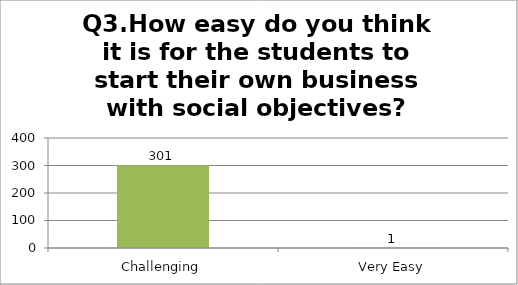
| Category | Q3.How easy do you think it is for the students to start their own business with social objectives? |
|---|---|
| Challenging | 301 |
| Very Easy | 1 |